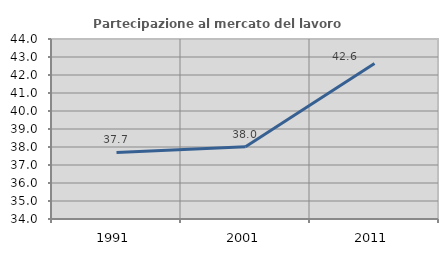
| Category | Partecipazione al mercato del lavoro  femminile |
|---|---|
| 1991.0 | 37.697 |
| 2001.0 | 38.019 |
| 2011.0 | 42.636 |